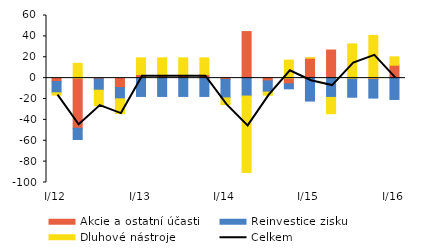
| Category | Akcie a ostatní účasti | Reinvestice zisku | Dluhové nástroje |
|---|---|---|---|
| I/12 | -3.253 | -10.785 | -2.251 |
| II | -48.016 | -10.785 | 14.16 |
| III | -0.777 | -10.785 | -14.771 |
| IV | -9.051 | -10.785 | -14.161 |
| I/13 | 3.515 | -17.551 | 15.896 |
| II | 3.515 | -17.551 | 15.896 |
| III | 3.515 | -17.551 | 15.896 |
| IV | 3.515 | -17.551 | 15.896 |
| I/14 | -1.198 | -17.743 | -6.432 |
| II | 44.625 | -17.186 | -73.154 |
| III | -2.62 | -10.736 | -2.994 |
| IV | -5.482 | -4.752 | 17.289 |
| I/15 | 19.073 | -21.986 | 0.416 |
| II | 26.914 | -18.494 | -15.581 |
| III | -0.506 | -17.814 | 32.777 |
| IV | -1.392 | -17.753 | 40.964 |
| I/16 | 12.412 | -20.448 | 8.018 |